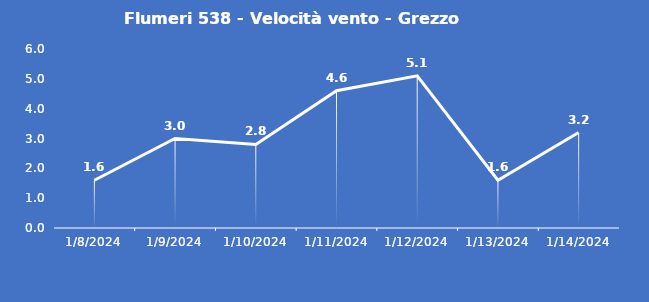
| Category | Flumeri 538 - Velocità vento - Grezzo (m/s) |
|---|---|
| 1/8/24 | 1.6 |
| 1/9/24 | 3 |
| 1/10/24 | 2.8 |
| 1/11/24 | 4.6 |
| 1/12/24 | 5.1 |
| 1/13/24 | 1.6 |
| 1/14/24 | 3.2 |